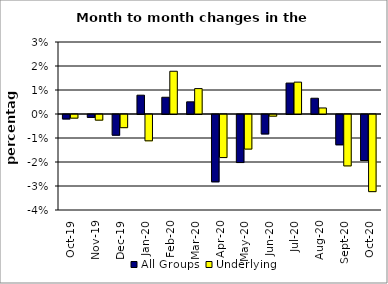
| Category | All Groups | Underlying |
|---|---|---|
| 2019-10-01 | -0.002 | -0.002 |
| 2019-11-01 | -0.001 | -0.002 |
| 2019-12-01 | -0.009 | -0.005 |
| 2020-01-01 | 0.008 | -0.011 |
| 2020-02-01 | 0.007 | 0.018 |
| 2020-03-01 | 0.005 | 0.011 |
| 2020-04-01 | -0.028 | -0.018 |
| 2020-05-01 | -0.02 | -0.014 |
| 2020-06-01 | -0.008 | -0.001 |
| 2020-07-01 | 0.013 | 0.013 |
| 2020-08-01 | 0.007 | 0.003 |
| 2020-09-01 | -0.013 | -0.021 |
| 2020-10-01 | -0.019 | -0.032 |